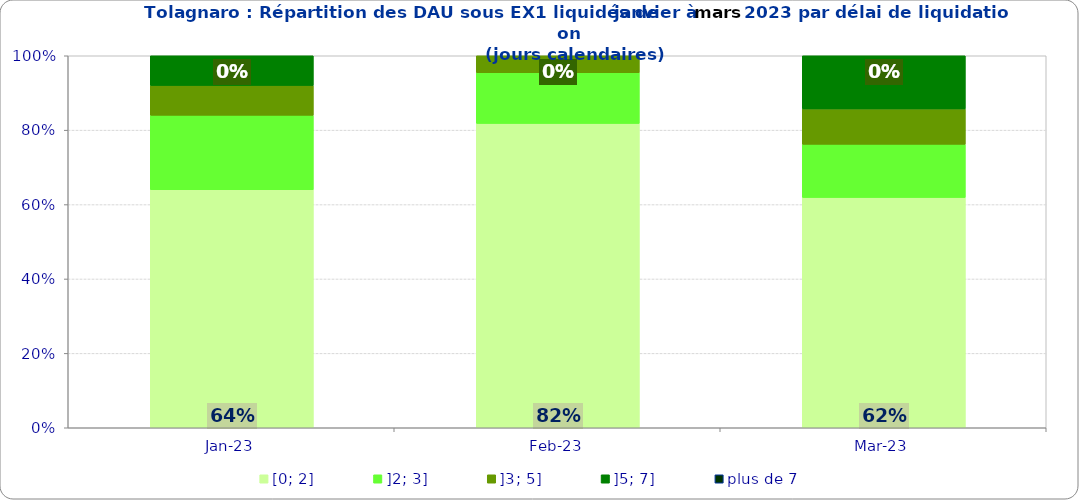
| Category | [0; 2] | ]2; 3] | ]3; 5] | ]5; 7] | plus de 7 |
|---|---|---|---|---|---|
| 2023-01-01 | 0.64 | 0.2 | 0.08 | 0.08 | 0 |
| 2023-02-01 | 0.818 | 0.136 | 0.045 | 0 | 0 |
| 2023-03-01 | 0.619 | 0.143 | 0.095 | 0.143 | 0 |